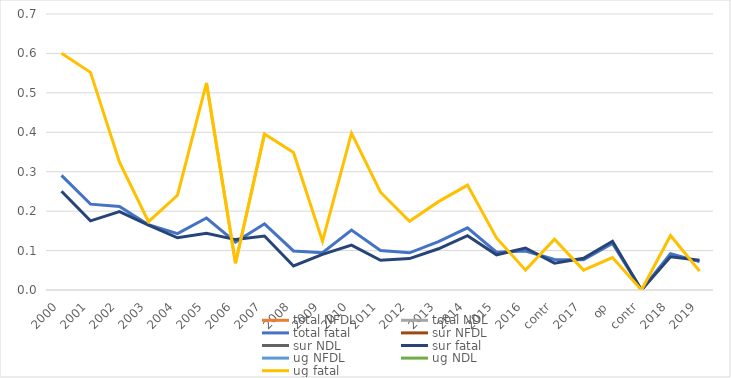
| Category | total NFDL | total NDL | total fatal | sur NFDL | sur NDL | sur fatal | ug NFDL | ug NDL | ug fatal |
|---|---|---|---|---|---|---|---|---|---|
| 2000 | 26.51 | 13.886 | 0.291 | 24.723 | 12.547 | 0.251 | 40.318 | 24.231 | 0.601 |
| 2001 | 23.185 | 12.343 | 0.218 | 22.176 | 11.22 | 0.175 | 31.121 | 21.184 | 0.552 |
| 2002 | 21.451 | 10.758 | 0.212 | 20.38 | 10.086 | 0.199 | 31.06 | 16.787 | 0.324 |
| 2003 | 20.714 | 10.146 | 0.165 | 19.509 | 9.489 | 0.165 | 32.124 | 16.365 | 0.173 |
| 2004 | 20.653 | 10.764 | 0.143 | 19.654 | 9.973 | 0.132 | 29.723 | 17.946 | 0.24 |
| 2005 | 20.592 | 10.829 | 0.183 | 19.597 | 9.697 | 0.144 | 29.407 | 20.855 | 0.525 |
| 2006 | 18.995 | 9.508 | 0.122 | 18.064 | 8.892 | 0.128 | 26.913 | 14.748 | 0.068 |
| 2007 | 17.434 | 8.516 | 0.168 | 16.499 | 7.705 | 0.137 | 24.379 | 14.537 | 0.396 |
| 2008 | 14.985 | 7.862 | 0.099 | 14.023 | 7.114 | 0.061 | 21.278 | 12.757 | 0.349 |
| 2009 | 12.492 | 6.604 | 0.094 | 11.262 | 5.942 | 0.09 | 20.942 | 11.152 | 0.124 |
| 2010 | 12.365 | 5.947 | 0.152 | 10.819 | 5.225 | 0.114 | 22.386 | 10.625 | 0.398 |
| 2011 | 12.109 | 6.226 | 0.1 | 10.947 | 5.453 | 0.075 | 18.997 | 10.813 | 0.248 |
| 2012 | 11.784 | 6.06 | 0.094 | 10.401 | 5.447 | 0.08 | 19.358 | 9.418 | 0.174 |
| 2013 | 11.462 | 5.363 | 0.123 | 10.647 | 4.764 | 0.105 | 16 | 8.694 | 0.224 |
| 2014 | 11.061 | 5.082 | 0.158 | 10.457 | 4.852 | 0.138 | 14.368 | 6.341 | 0.266 |
| 2015 | 10.741 | 5.491 | 0.096 | 10.239 | 5.132 | 0.089 | 13.462 | 7.435 | 0.132 |
| 2016 | 10.381 | 5 | 0.099 | 10.071 | 4.724 | 0.107 | 12.29 | 6.699 | 0.05 |
| contr | 3.42 | 2.145 | 0.077 | 3.409 | 1.864 | 0.068 | 3.484 | 3.742 | 0.129 |
| 2017 | 9.725 | 4.206 | 0.076 | 9.346 | 4.032 | 0.081 | 12.097 | 5.293 | 0.05 |
| op | 13.297 | 5.476 | 0.118 | 12.76 | 5.248 | 0.124 | 16.868 | 6.994 | 0.082 |
| contr | 3.202 | 1.886 | 0 | 2.962 | 1.759 | 0 | 4.554 | 2.602 | 0 |
| 2018 | 9.885 | 4.434 | 0.092 | 9.692 | 3.984 | 0.084 | 11.045 | 7.133 | 0.138 |
| 2019 | 10.065 | 4.447 | 0.072 | 9.723 | 4.177 | 0.076 | 12.248 | 6.172 | 0.048 |